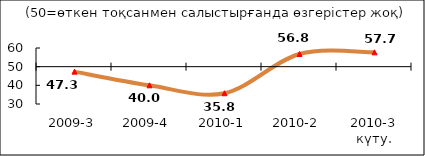
| Category | Series 5 |
|---|---|
| 2009-3 | 47.335 |
| 2009-4 | 40.005 |
| 2010-1 | 35.765 |
| 2010-2 | 56.79 |
| 2010-3 күту. | 57.675 |